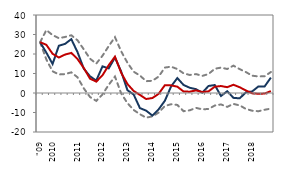
| Category | lower bound | median | upper bound |
|---|---|---|---|
| "09 | 26.072 | 26.072 | 26.072 |
|  | 24.7 | 20.681 | 32.273 |
| 2010 | 20.117 | 14.876 | 29.669 |
|  | 18.19 | 24.226 | 28.139 |
|  | 19.714 | 25.193 | 28.725 |
|  | 20.554 | 27.62 | 29.622 |
| 2011 | 17.412 | 20.943 | 27.024 |
|  | 12.825 | 12.496 | 22.4 |
|  | 7.351 | 8.57 | 17.6 |
|  | 5.841 | 6.378 | 15.065 |
| 2012 | 9.069 | 13.654 | 19.107 |
|  | 14.27 | 12.61 | 24.057 |
|  | 18.616 | 18.162 | 28.637 |
|  | 10.347 | 11.013 | 21.355 |
| 2013 | 4.601 | 1.441 | 15.514 |
|  | 1.049 | -0.787 | 10.909 |
|  | -0.99 | -7.727 | 8.976 |
|  | -3.086 | -9.052 | 6.055 |
| 2014 | -2.577 | -11.562 | 6.278 |
|  | -0.431 | -8.404 | 8.41 |
|  | 3.988 | -3.99 | 13.04 |
|  | 3.904 | 3.366 | 13.489 |
| 2015 | 3.248 | 7.67 | 12.294 |
|  | 0.762 | 4.117 | 10.091 |
|  | 0.68 | 2.678 | 9.243 |
|  | 1.334 | 1.963 | 9.701 |
| 2016 | 0.509 | 0.151 | 8.764 |
|  | 0.834 | 3.602 | 9.74 |
|  | 3.239 | 4.079 | 12.409 |
|  | 3.57 | -1.527 | 13.027 |
| 2017 | 2.983 | 0.919 | 12.3 |
|  | 4.23 | -2.499 | 14.026 |
|  | 2.942 | -2.738 | 12.253 |
|  | 1.296 | 0.364 | 10.729 |
| 2018 | -0.185 | 0.81 | 8.872 |